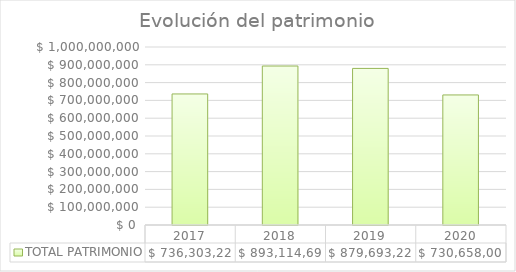
| Category | TOTAL PATRIMONIO |
|---|---|
| 2017.0 | 736303225.14 |
| 2018.0 | 893114694.6 |
| 2019.0 | 879693220 |
| 2020.0 | 730658000 |